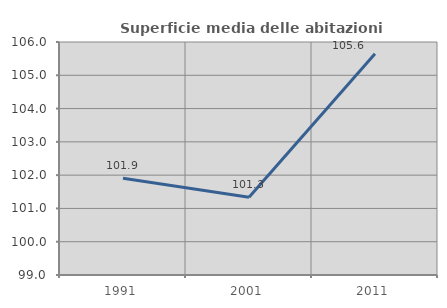
| Category | Superficie media delle abitazioni occupate |
|---|---|
| 1991.0 | 101.906 |
| 2001.0 | 101.334 |
| 2011.0 | 105.649 |